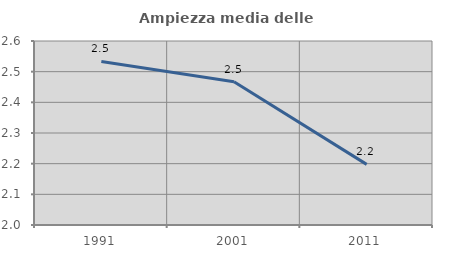
| Category | Ampiezza media delle famiglie |
|---|---|
| 1991.0 | 2.533 |
| 2001.0 | 2.467 |
| 2011.0 | 2.198 |